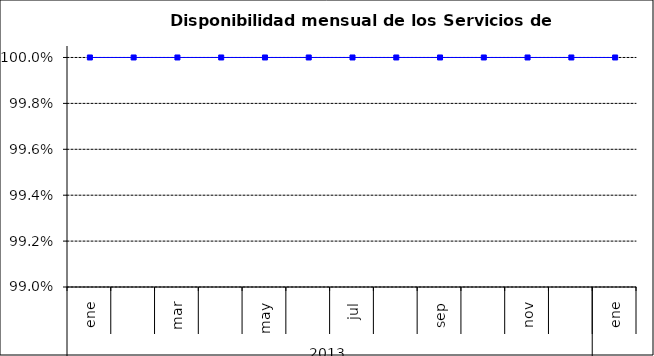
| Category | SCL |
|---|---|
| 0 | 1 |
| 1 | 1 |
| 2 | 1 |
| 3 | 1 |
| 4 | 1 |
| 5 | 1 |
| 6 | 1 |
| 7 | 1 |
| 8 | 1 |
| 9 | 1 |
| 10 | 1 |
| 11 | 1 |
| 12 | 1 |